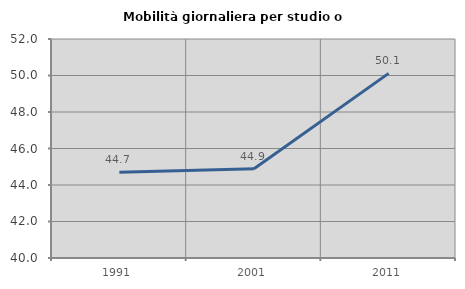
| Category | Mobilità giornaliera per studio o lavoro |
|---|---|
| 1991.0 | 44.692 |
| 2001.0 | 44.892 |
| 2011.0 | 50.116 |